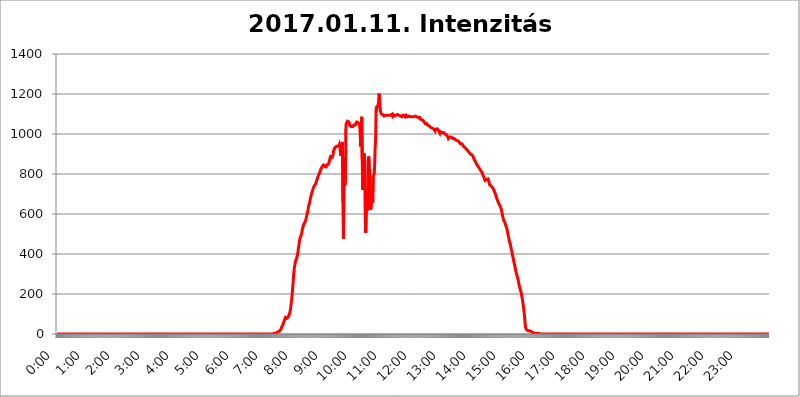
| Category | 2017.01.11. Intenzitás [W/m^2] |
|---|---|
| 0.0 | 0 |
| 0.0006944444444444445 | 0 |
| 0.001388888888888889 | 0 |
| 0.0020833333333333333 | 0 |
| 0.002777777777777778 | 0 |
| 0.003472222222222222 | 0 |
| 0.004166666666666667 | 0 |
| 0.004861111111111111 | 0 |
| 0.005555555555555556 | 0 |
| 0.0062499999999999995 | 0 |
| 0.006944444444444444 | 0 |
| 0.007638888888888889 | 0 |
| 0.008333333333333333 | 0 |
| 0.009027777777777779 | 0 |
| 0.009722222222222222 | 0 |
| 0.010416666666666666 | 0 |
| 0.011111111111111112 | 0 |
| 0.011805555555555555 | 0 |
| 0.012499999999999999 | 0 |
| 0.013194444444444444 | 0 |
| 0.013888888888888888 | 0 |
| 0.014583333333333332 | 0 |
| 0.015277777777777777 | 0 |
| 0.015972222222222224 | 0 |
| 0.016666666666666666 | 0 |
| 0.017361111111111112 | 0 |
| 0.018055555555555557 | 0 |
| 0.01875 | 0 |
| 0.019444444444444445 | 0 |
| 0.02013888888888889 | 0 |
| 0.020833333333333332 | 0 |
| 0.02152777777777778 | 0 |
| 0.022222222222222223 | 0 |
| 0.02291666666666667 | 0 |
| 0.02361111111111111 | 0 |
| 0.024305555555555556 | 0 |
| 0.024999999999999998 | 0 |
| 0.025694444444444447 | 0 |
| 0.02638888888888889 | 0 |
| 0.027083333333333334 | 0 |
| 0.027777777777777776 | 0 |
| 0.02847222222222222 | 0 |
| 0.029166666666666664 | 0 |
| 0.029861111111111113 | 0 |
| 0.030555555555555555 | 0 |
| 0.03125 | 0 |
| 0.03194444444444445 | 0 |
| 0.03263888888888889 | 0 |
| 0.03333333333333333 | 0 |
| 0.034027777777777775 | 0 |
| 0.034722222222222224 | 0 |
| 0.035416666666666666 | 0 |
| 0.036111111111111115 | 0 |
| 0.03680555555555556 | 0 |
| 0.0375 | 0 |
| 0.03819444444444444 | 0 |
| 0.03888888888888889 | 0 |
| 0.03958333333333333 | 0 |
| 0.04027777777777778 | 0 |
| 0.04097222222222222 | 0 |
| 0.041666666666666664 | 0 |
| 0.042361111111111106 | 0 |
| 0.04305555555555556 | 0 |
| 0.043750000000000004 | 0 |
| 0.044444444444444446 | 0 |
| 0.04513888888888889 | 0 |
| 0.04583333333333334 | 0 |
| 0.04652777777777778 | 0 |
| 0.04722222222222222 | 0 |
| 0.04791666666666666 | 0 |
| 0.04861111111111111 | 0 |
| 0.049305555555555554 | 0 |
| 0.049999999999999996 | 0 |
| 0.05069444444444445 | 0 |
| 0.051388888888888894 | 0 |
| 0.052083333333333336 | 0 |
| 0.05277777777777778 | 0 |
| 0.05347222222222222 | 0 |
| 0.05416666666666667 | 0 |
| 0.05486111111111111 | 0 |
| 0.05555555555555555 | 0 |
| 0.05625 | 0 |
| 0.05694444444444444 | 0 |
| 0.057638888888888885 | 0 |
| 0.05833333333333333 | 0 |
| 0.05902777777777778 | 0 |
| 0.059722222222222225 | 0 |
| 0.06041666666666667 | 0 |
| 0.061111111111111116 | 0 |
| 0.06180555555555556 | 0 |
| 0.0625 | 0 |
| 0.06319444444444444 | 0 |
| 0.06388888888888888 | 0 |
| 0.06458333333333334 | 0 |
| 0.06527777777777778 | 0 |
| 0.06597222222222222 | 0 |
| 0.06666666666666667 | 0 |
| 0.06736111111111111 | 0 |
| 0.06805555555555555 | 0 |
| 0.06874999999999999 | 0 |
| 0.06944444444444443 | 0 |
| 0.07013888888888889 | 0 |
| 0.07083333333333333 | 0 |
| 0.07152777777777779 | 0 |
| 0.07222222222222223 | 0 |
| 0.07291666666666667 | 0 |
| 0.07361111111111111 | 0 |
| 0.07430555555555556 | 0 |
| 0.075 | 0 |
| 0.07569444444444444 | 0 |
| 0.0763888888888889 | 0 |
| 0.07708333333333334 | 0 |
| 0.07777777777777778 | 0 |
| 0.07847222222222222 | 0 |
| 0.07916666666666666 | 0 |
| 0.0798611111111111 | 0 |
| 0.08055555555555556 | 0 |
| 0.08125 | 0 |
| 0.08194444444444444 | 0 |
| 0.08263888888888889 | 0 |
| 0.08333333333333333 | 0 |
| 0.08402777777777777 | 0 |
| 0.08472222222222221 | 0 |
| 0.08541666666666665 | 0 |
| 0.08611111111111112 | 0 |
| 0.08680555555555557 | 0 |
| 0.08750000000000001 | 0 |
| 0.08819444444444445 | 0 |
| 0.08888888888888889 | 0 |
| 0.08958333333333333 | 0 |
| 0.09027777777777778 | 0 |
| 0.09097222222222222 | 0 |
| 0.09166666666666667 | 0 |
| 0.09236111111111112 | 0 |
| 0.09305555555555556 | 0 |
| 0.09375 | 0 |
| 0.09444444444444444 | 0 |
| 0.09513888888888888 | 0 |
| 0.09583333333333333 | 0 |
| 0.09652777777777777 | 0 |
| 0.09722222222222222 | 0 |
| 0.09791666666666667 | 0 |
| 0.09861111111111111 | 0 |
| 0.09930555555555555 | 0 |
| 0.09999999999999999 | 0 |
| 0.10069444444444443 | 0 |
| 0.1013888888888889 | 0 |
| 0.10208333333333335 | 0 |
| 0.10277777777777779 | 0 |
| 0.10347222222222223 | 0 |
| 0.10416666666666667 | 0 |
| 0.10486111111111111 | 0 |
| 0.10555555555555556 | 0 |
| 0.10625 | 0 |
| 0.10694444444444444 | 0 |
| 0.1076388888888889 | 0 |
| 0.10833333333333334 | 0 |
| 0.10902777777777778 | 0 |
| 0.10972222222222222 | 0 |
| 0.1111111111111111 | 0 |
| 0.11180555555555556 | 0 |
| 0.11180555555555556 | 0 |
| 0.1125 | 0 |
| 0.11319444444444444 | 0 |
| 0.11388888888888889 | 0 |
| 0.11458333333333333 | 0 |
| 0.11527777777777777 | 0 |
| 0.11597222222222221 | 0 |
| 0.11666666666666665 | 0 |
| 0.1173611111111111 | 0 |
| 0.11805555555555557 | 0 |
| 0.11944444444444445 | 0 |
| 0.12013888888888889 | 0 |
| 0.12083333333333333 | 0 |
| 0.12152777777777778 | 0 |
| 0.12222222222222223 | 0 |
| 0.12291666666666667 | 0 |
| 0.12291666666666667 | 0 |
| 0.12361111111111112 | 0 |
| 0.12430555555555556 | 0 |
| 0.125 | 0 |
| 0.12569444444444444 | 0 |
| 0.12638888888888888 | 0 |
| 0.12708333333333333 | 0 |
| 0.16875 | 0 |
| 0.12847222222222224 | 0 |
| 0.12916666666666668 | 0 |
| 0.12986111111111112 | 0 |
| 0.13055555555555556 | 0 |
| 0.13125 | 0 |
| 0.13194444444444445 | 0 |
| 0.1326388888888889 | 0 |
| 0.13333333333333333 | 0 |
| 0.13402777777777777 | 0 |
| 0.13402777777777777 | 0 |
| 0.13472222222222222 | 0 |
| 0.13541666666666666 | 0 |
| 0.1361111111111111 | 0 |
| 0.13749999999999998 | 0 |
| 0.13819444444444443 | 0 |
| 0.1388888888888889 | 0 |
| 0.13958333333333334 | 0 |
| 0.14027777777777778 | 0 |
| 0.14097222222222222 | 0 |
| 0.14166666666666666 | 0 |
| 0.1423611111111111 | 0 |
| 0.14305555555555557 | 0 |
| 0.14375000000000002 | 0 |
| 0.14444444444444446 | 0 |
| 0.1451388888888889 | 0 |
| 0.1451388888888889 | 0 |
| 0.14652777777777778 | 0 |
| 0.14722222222222223 | 0 |
| 0.14791666666666667 | 0 |
| 0.1486111111111111 | 0 |
| 0.14930555555555555 | 0 |
| 0.15 | 0 |
| 0.15069444444444444 | 0 |
| 0.15138888888888888 | 0 |
| 0.15208333333333332 | 0 |
| 0.15277777777777776 | 0 |
| 0.15347222222222223 | 0 |
| 0.15416666666666667 | 0 |
| 0.15486111111111112 | 0 |
| 0.15555555555555556 | 0 |
| 0.15625 | 0 |
| 0.15694444444444444 | 0 |
| 0.15763888888888888 | 0 |
| 0.15833333333333333 | 0 |
| 0.15902777777777777 | 0 |
| 0.15972222222222224 | 0 |
| 0.16041666666666668 | 0 |
| 0.16111111111111112 | 0 |
| 0.16180555555555556 | 0 |
| 0.1625 | 0 |
| 0.16319444444444445 | 0 |
| 0.1638888888888889 | 0 |
| 0.16458333333333333 | 0 |
| 0.16527777777777777 | 0 |
| 0.16597222222222222 | 0 |
| 0.16666666666666666 | 0 |
| 0.1673611111111111 | 0 |
| 0.16805555555555554 | 0 |
| 0.16874999999999998 | 0 |
| 0.16944444444444443 | 0 |
| 0.17013888888888887 | 0 |
| 0.1708333333333333 | 0 |
| 0.17152777777777775 | 0 |
| 0.17222222222222225 | 0 |
| 0.1729166666666667 | 0 |
| 0.17361111111111113 | 0 |
| 0.17430555555555557 | 0 |
| 0.17500000000000002 | 0 |
| 0.17569444444444446 | 0 |
| 0.1763888888888889 | 0 |
| 0.17708333333333334 | 0 |
| 0.17777777777777778 | 0 |
| 0.17847222222222223 | 0 |
| 0.17916666666666667 | 0 |
| 0.1798611111111111 | 0 |
| 0.18055555555555555 | 0 |
| 0.18125 | 0 |
| 0.18194444444444444 | 0 |
| 0.1826388888888889 | 0 |
| 0.18333333333333335 | 0 |
| 0.1840277777777778 | 0 |
| 0.18472222222222223 | 0 |
| 0.18541666666666667 | 0 |
| 0.18611111111111112 | 0 |
| 0.18680555555555556 | 0 |
| 0.1875 | 0 |
| 0.18819444444444444 | 0 |
| 0.18888888888888888 | 0 |
| 0.18958333333333333 | 0 |
| 0.19027777777777777 | 0 |
| 0.1909722222222222 | 0 |
| 0.19166666666666665 | 0 |
| 0.19236111111111112 | 0 |
| 0.19305555555555554 | 0 |
| 0.19375 | 0 |
| 0.19444444444444445 | 0 |
| 0.1951388888888889 | 0 |
| 0.19583333333333333 | 0 |
| 0.19652777777777777 | 0 |
| 0.19722222222222222 | 0 |
| 0.19791666666666666 | 0 |
| 0.1986111111111111 | 0 |
| 0.19930555555555554 | 0 |
| 0.19999999999999998 | 0 |
| 0.20069444444444443 | 0 |
| 0.20138888888888887 | 0 |
| 0.2020833333333333 | 0 |
| 0.2027777777777778 | 0 |
| 0.2034722222222222 | 0 |
| 0.2041666666666667 | 0 |
| 0.20486111111111113 | 0 |
| 0.20555555555555557 | 0 |
| 0.20625000000000002 | 0 |
| 0.20694444444444446 | 0 |
| 0.2076388888888889 | 0 |
| 0.20833333333333334 | 0 |
| 0.20902777777777778 | 0 |
| 0.20972222222222223 | 0 |
| 0.21041666666666667 | 0 |
| 0.2111111111111111 | 0 |
| 0.21180555555555555 | 0 |
| 0.2125 | 0 |
| 0.21319444444444444 | 0 |
| 0.2138888888888889 | 0 |
| 0.21458333333333335 | 0 |
| 0.2152777777777778 | 0 |
| 0.21597222222222223 | 0 |
| 0.21666666666666667 | 0 |
| 0.21736111111111112 | 0 |
| 0.21805555555555556 | 0 |
| 0.21875 | 0 |
| 0.21944444444444444 | 0 |
| 0.22013888888888888 | 0 |
| 0.22083333333333333 | 0 |
| 0.22152777777777777 | 0 |
| 0.2222222222222222 | 0 |
| 0.22291666666666665 | 0 |
| 0.2236111111111111 | 0 |
| 0.22430555555555556 | 0 |
| 0.225 | 0 |
| 0.22569444444444445 | 0 |
| 0.2263888888888889 | 0 |
| 0.22708333333333333 | 0 |
| 0.22777777777777777 | 0 |
| 0.22847222222222222 | 0 |
| 0.22916666666666666 | 0 |
| 0.2298611111111111 | 0 |
| 0.23055555555555554 | 0 |
| 0.23124999999999998 | 0 |
| 0.23194444444444443 | 0 |
| 0.23263888888888887 | 0 |
| 0.2333333333333333 | 0 |
| 0.2340277777777778 | 0 |
| 0.2347222222222222 | 0 |
| 0.2354166666666667 | 0 |
| 0.23611111111111113 | 0 |
| 0.23680555555555557 | 0 |
| 0.23750000000000002 | 0 |
| 0.23819444444444446 | 0 |
| 0.2388888888888889 | 0 |
| 0.23958333333333334 | 0 |
| 0.24027777777777778 | 0 |
| 0.24097222222222223 | 0 |
| 0.24166666666666667 | 0 |
| 0.2423611111111111 | 0 |
| 0.24305555555555555 | 0 |
| 0.24375 | 0 |
| 0.24444444444444446 | 0 |
| 0.24513888888888888 | 0 |
| 0.24583333333333335 | 0 |
| 0.2465277777777778 | 0 |
| 0.24722222222222223 | 0 |
| 0.24791666666666667 | 0 |
| 0.24861111111111112 | 0 |
| 0.24930555555555556 | 0 |
| 0.25 | 0 |
| 0.25069444444444444 | 0 |
| 0.2513888888888889 | 0 |
| 0.2520833333333333 | 0 |
| 0.25277777777777777 | 0 |
| 0.2534722222222222 | 0 |
| 0.25416666666666665 | 0 |
| 0.2548611111111111 | 0 |
| 0.2555555555555556 | 0 |
| 0.25625000000000003 | 0 |
| 0.2569444444444445 | 0 |
| 0.2576388888888889 | 0 |
| 0.25833333333333336 | 0 |
| 0.2590277777777778 | 0 |
| 0.25972222222222224 | 0 |
| 0.2604166666666667 | 0 |
| 0.2611111111111111 | 0 |
| 0.26180555555555557 | 0 |
| 0.2625 | 0 |
| 0.26319444444444445 | 0 |
| 0.2638888888888889 | 0 |
| 0.26458333333333334 | 0 |
| 0.2652777777777778 | 0 |
| 0.2659722222222222 | 0 |
| 0.26666666666666666 | 0 |
| 0.2673611111111111 | 0 |
| 0.26805555555555555 | 0 |
| 0.26875 | 0 |
| 0.26944444444444443 | 0 |
| 0.2701388888888889 | 0 |
| 0.2708333333333333 | 0 |
| 0.27152777777777776 | 0 |
| 0.2722222222222222 | 0 |
| 0.27291666666666664 | 0 |
| 0.2736111111111111 | 0 |
| 0.2743055555555555 | 0 |
| 0.27499999999999997 | 0 |
| 0.27569444444444446 | 0 |
| 0.27638888888888885 | 0 |
| 0.27708333333333335 | 0 |
| 0.2777777777777778 | 0 |
| 0.27847222222222223 | 0 |
| 0.2791666666666667 | 0 |
| 0.2798611111111111 | 0 |
| 0.28055555555555556 | 0 |
| 0.28125 | 0 |
| 0.28194444444444444 | 0 |
| 0.2826388888888889 | 0 |
| 0.2833333333333333 | 0 |
| 0.28402777777777777 | 0 |
| 0.2847222222222222 | 0 |
| 0.28541666666666665 | 0 |
| 0.28611111111111115 | 0 |
| 0.28680555555555554 | 0 |
| 0.28750000000000003 | 0 |
| 0.2881944444444445 | 0 |
| 0.2888888888888889 | 0 |
| 0.28958333333333336 | 0 |
| 0.2902777777777778 | 0 |
| 0.29097222222222224 | 0 |
| 0.2916666666666667 | 0 |
| 0.2923611111111111 | 0 |
| 0.29305555555555557 | 0 |
| 0.29375 | 0 |
| 0.29444444444444445 | 0 |
| 0.2951388888888889 | 0 |
| 0.29583333333333334 | 0 |
| 0.2965277777777778 | 0 |
| 0.2972222222222222 | 0 |
| 0.29791666666666666 | 0 |
| 0.2986111111111111 | 0 |
| 0.29930555555555555 | 0 |
| 0.3 | 0 |
| 0.30069444444444443 | 0 |
| 0.3013888888888889 | 0 |
| 0.3020833333333333 | 0 |
| 0.30277777777777776 | 3.525 |
| 0.3034722222222222 | 3.525 |
| 0.30416666666666664 | 3.525 |
| 0.3048611111111111 | 3.525 |
| 0.3055555555555555 | 3.525 |
| 0.30624999999999997 | 3.525 |
| 0.3069444444444444 | 3.525 |
| 0.3076388888888889 | 7.887 |
| 0.30833333333333335 | 7.887 |
| 0.3090277777777778 | 7.887 |
| 0.30972222222222223 | 12.257 |
| 0.3104166666666667 | 12.257 |
| 0.3111111111111111 | 12.257 |
| 0.31180555555555556 | 12.257 |
| 0.3125 | 16.636 |
| 0.31319444444444444 | 21.024 |
| 0.3138888888888889 | 25.419 |
| 0.3145833333333333 | 29.823 |
| 0.31527777777777777 | 38.653 |
| 0.3159722222222222 | 43.079 |
| 0.31666666666666665 | 47.511 |
| 0.31736111111111115 | 56.398 |
| 0.31805555555555554 | 60.85 |
| 0.31875000000000003 | 69.775 |
| 0.3194444444444445 | 74.246 |
| 0.3201388888888889 | 83.205 |
| 0.32083333333333336 | 83.205 |
| 0.3215277777777778 | 83.205 |
| 0.32222222222222224 | 78.722 |
| 0.3229166666666667 | 83.205 |
| 0.3236111111111111 | 83.205 |
| 0.32430555555555557 | 87.692 |
| 0.325 | 92.184 |
| 0.32569444444444445 | 101.184 |
| 0.3263888888888889 | 110.201 |
| 0.32708333333333334 | 123.758 |
| 0.3277777777777778 | 141.884 |
| 0.3284722222222222 | 164.605 |
| 0.32916666666666666 | 182.82 |
| 0.3298611111111111 | 214.746 |
| 0.33055555555555555 | 246.689 |
| 0.33125 | 283.156 |
| 0.33194444444444443 | 310.44 |
| 0.3326388888888889 | 333.113 |
| 0.3333333333333333 | 346.682 |
| 0.3340277777777778 | 360.221 |
| 0.3347222222222222 | 369.23 |
| 0.3354166666666667 | 373.729 |
| 0.3361111111111111 | 382.715 |
| 0.3368055555555556 | 387.202 |
| 0.33749999999999997 | 405.108 |
| 0.33819444444444446 | 427.39 |
| 0.33888888888888885 | 440.702 |
| 0.33958333333333335 | 462.786 |
| 0.34027777777777773 | 475.972 |
| 0.34097222222222223 | 480.356 |
| 0.3416666666666666 | 489.108 |
| 0.3423611111111111 | 497.836 |
| 0.3430555555555555 | 506.542 |
| 0.34375 | 523.88 |
| 0.3444444444444445 | 532.513 |
| 0.3451388888888889 | 541.121 |
| 0.3458333333333334 | 549.704 |
| 0.34652777777777777 | 545.416 |
| 0.34722222222222227 | 549.704 |
| 0.34791666666666665 | 562.53 |
| 0.34861111111111115 | 571.049 |
| 0.34930555555555554 | 583.779 |
| 0.35000000000000003 | 592.233 |
| 0.3506944444444444 | 604.864 |
| 0.3513888888888889 | 613.252 |
| 0.3520833333333333 | 629.948 |
| 0.3527777777777778 | 642.4 |
| 0.3534722222222222 | 650.667 |
| 0.3541666666666667 | 658.909 |
| 0.3548611111111111 | 675.311 |
| 0.35555555555555557 | 683.473 |
| 0.35625 | 695.666 |
| 0.35694444444444445 | 703.762 |
| 0.3576388888888889 | 711.832 |
| 0.35833333333333334 | 719.877 |
| 0.3590277777777778 | 727.896 |
| 0.3597222222222222 | 735.89 |
| 0.36041666666666666 | 739.877 |
| 0.3611111111111111 | 743.859 |
| 0.36180555555555555 | 747.834 |
| 0.3625 | 751.803 |
| 0.36319444444444443 | 759.723 |
| 0.3638888888888889 | 767.62 |
| 0.3645833333333333 | 775.492 |
| 0.3652777777777778 | 783.342 |
| 0.3659722222222222 | 787.258 |
| 0.3666666666666667 | 795.074 |
| 0.3673611111111111 | 798.974 |
| 0.3680555555555556 | 806.757 |
| 0.36874999999999997 | 810.641 |
| 0.36944444444444446 | 822.26 |
| 0.37013888888888885 | 822.26 |
| 0.37083333333333335 | 829.981 |
| 0.37152777777777773 | 837.682 |
| 0.37222222222222223 | 837.682 |
| 0.3729166666666666 | 841.526 |
| 0.3736111111111111 | 845.365 |
| 0.3743055555555555 | 849.199 |
| 0.375 | 841.526 |
| 0.3756944444444445 | 841.526 |
| 0.3763888888888889 | 829.981 |
| 0.3770833333333334 | 837.682 |
| 0.37777777777777777 | 841.526 |
| 0.37847222222222227 | 845.365 |
| 0.37916666666666665 | 845.365 |
| 0.37986111111111115 | 845.365 |
| 0.38055555555555554 | 849.199 |
| 0.38125000000000003 | 860.676 |
| 0.3819444444444444 | 868.305 |
| 0.3826388888888889 | 879.719 |
| 0.3833333333333333 | 887.309 |
| 0.3840277777777778 | 883.516 |
| 0.3847222222222222 | 883.516 |
| 0.3854166666666667 | 883.516 |
| 0.3861111111111111 | 887.309 |
| 0.38680555555555557 | 894.885 |
| 0.3875 | 913.766 |
| 0.38819444444444445 | 921.298 |
| 0.3888888888888889 | 928.819 |
| 0.38958333333333334 | 925.06 |
| 0.3902777777777778 | 932.576 |
| 0.3909722222222222 | 936.33 |
| 0.39166666666666666 | 936.33 |
| 0.3923611111111111 | 932.576 |
| 0.39305555555555555 | 940.082 |
| 0.39375 | 940.082 |
| 0.39444444444444443 | 940.082 |
| 0.3951388888888889 | 940.082 |
| 0.3958333333333333 | 947.58 |
| 0.3965277777777778 | 936.33 |
| 0.3972222222222222 | 902.447 |
| 0.3979166666666667 | 891.099 |
| 0.3986111111111111 | 887.309 |
| 0.3993055555555556 | 940.082 |
| 0.39999999999999997 | 958.814 |
| 0.40069444444444446 | 658.909 |
| 0.40138888888888885 | 475.972 |
| 0.40208333333333335 | 771.559 |
| 0.40277777777777773 | 751.803 |
| 0.40347222222222223 | 743.859 |
| 0.4041666666666666 | 767.62 |
| 0.4048611111111111 | 1044.762 |
| 0.4055555555555555 | 1052.255 |
| 0.40625 | 1052.255 |
| 0.4069444444444445 | 1063.51 |
| 0.4076388888888889 | 1067.267 |
| 0.4083333333333334 | 1063.51 |
| 0.40902777777777777 | 1059.756 |
| 0.40972222222222227 | 1052.255 |
| 0.41041666666666665 | 1041.019 |
| 0.41111111111111115 | 1041.019 |
| 0.41180555555555554 | 1041.019 |
| 0.41250000000000003 | 1037.277 |
| 0.4131944444444444 | 1037.277 |
| 0.4138888888888889 | 1037.277 |
| 0.4145833333333333 | 1037.277 |
| 0.4152777777777778 | 1037.277 |
| 0.4159722222222222 | 1044.762 |
| 0.4166666666666667 | 1048.508 |
| 0.4173611111111111 | 1044.762 |
| 0.41805555555555557 | 1044.762 |
| 0.41875 | 1052.255 |
| 0.41944444444444445 | 1056.004 |
| 0.4201388888888889 | 1059.756 |
| 0.42083333333333334 | 1059.756 |
| 0.4215277777777778 | 1063.51 |
| 0.4222222222222222 | 1056.004 |
| 0.42291666666666666 | 1052.255 |
| 0.4236111111111111 | 1052.255 |
| 0.42430555555555555 | 1041.019 |
| 0.425 | 992.448 |
| 0.42569444444444443 | 936.33 |
| 0.4263888888888889 | 984.98 |
| 0.4270833333333333 | 1086.097 |
| 0.4277777777777778 | 872.114 |
| 0.4284722222222222 | 719.877 |
| 0.4291666666666667 | 822.26 |
| 0.4298611111111111 | 833.834 |
| 0.4305555555555556 | 902.447 |
| 0.43124999999999997 | 860.676 |
| 0.43194444444444446 | 583.779 |
| 0.43263888888888885 | 506.542 |
| 0.43333333333333335 | 617.436 |
| 0.43402777777777773 | 719.877 |
| 0.43472222222222223 | 617.436 |
| 0.4354166666666666 | 715.858 |
| 0.4361111111111111 | 849.199 |
| 0.4368055555555555 | 887.309 |
| 0.4375 | 841.526 |
| 0.4381944444444445 | 802.868 |
| 0.4388888888888889 | 667.123 |
| 0.4395833333333334 | 621.613 |
| 0.44027777777777777 | 621.613 |
| 0.44097222222222227 | 675.311 |
| 0.44166666666666665 | 675.311 |
| 0.44236111111111115 | 654.791 |
| 0.44305555555555554 | 787.258 |
| 0.44375000000000003 | 783.342 |
| 0.4444444444444444 | 798.974 |
| 0.4451388888888889 | 837.682 |
| 0.4458333333333333 | 928.819 |
| 0.4465277777777778 | 970.034 |
| 0.4472222222222222 | 1124.056 |
| 0.4479166666666667 | 1139.384 |
| 0.4486111111111111 | 1131.708 |
| 0.44930555555555557 | 1127.879 |
| 0.45 | 1135.543 |
| 0.45069444444444445 | 1154.814 |
| 0.4513888888888889 | 1201.843 |
| 0.45208333333333334 | 1182.099 |
| 0.4527777777777778 | 1131.708 |
| 0.4534722222222222 | 1112.618 |
| 0.45416666666666666 | 1101.226 |
| 0.4548611111111111 | 1097.437 |
| 0.45555555555555555 | 1097.437 |
| 0.45625 | 1097.437 |
| 0.45694444444444443 | 1093.653 |
| 0.4576388888888889 | 1093.653 |
| 0.4583333333333333 | 1089.873 |
| 0.4590277777777778 | 1093.653 |
| 0.4597222222222222 | 1093.653 |
| 0.4604166666666667 | 1093.653 |
| 0.4611111111111111 | 1093.653 |
| 0.4618055555555556 | 1093.653 |
| 0.46249999999999997 | 1093.653 |
| 0.46319444444444446 | 1093.653 |
| 0.46388888888888885 | 1097.437 |
| 0.46458333333333335 | 1093.653 |
| 0.46527777777777773 | 1093.653 |
| 0.46597222222222223 | 1097.437 |
| 0.4666666666666666 | 1093.653 |
| 0.4673611111111111 | 1093.653 |
| 0.4680555555555555 | 1093.653 |
| 0.46875 | 1097.437 |
| 0.4694444444444445 | 1093.653 |
| 0.4701388888888889 | 1089.873 |
| 0.4708333333333334 | 1097.437 |
| 0.47152777777777777 | 1093.653 |
| 0.47222222222222227 | 1093.653 |
| 0.47291666666666665 | 1089.873 |
| 0.47361111111111115 | 1089.873 |
| 0.47430555555555554 | 1093.653 |
| 0.47500000000000003 | 1093.653 |
| 0.4756944444444444 | 1093.653 |
| 0.4763888888888889 | 1093.653 |
| 0.4770833333333333 | 1097.437 |
| 0.4777777777777778 | 1097.437 |
| 0.4784722222222222 | 1097.437 |
| 0.4791666666666667 | 1093.653 |
| 0.4798611111111111 | 1089.873 |
| 0.48055555555555557 | 1089.873 |
| 0.48125 | 1089.873 |
| 0.48194444444444445 | 1089.873 |
| 0.4826388888888889 | 1089.873 |
| 0.48333333333333334 | 1086.097 |
| 0.4840277777777778 | 1089.873 |
| 0.4847222222222222 | 1093.653 |
| 0.48541666666666666 | 1089.873 |
| 0.4861111111111111 | 1089.873 |
| 0.48680555555555555 | 1093.653 |
| 0.4875 | 1089.873 |
| 0.48819444444444443 | 1086.097 |
| 0.4888888888888889 | 1086.097 |
| 0.4895833333333333 | 1093.653 |
| 0.4902777777777778 | 1089.873 |
| 0.4909722222222222 | 1089.873 |
| 0.4916666666666667 | 1086.097 |
| 0.4923611111111111 | 1086.097 |
| 0.4930555555555556 | 1086.097 |
| 0.49374999999999997 | 1089.873 |
| 0.49444444444444446 | 1089.873 |
| 0.49513888888888885 | 1086.097 |
| 0.49583333333333335 | 1086.097 |
| 0.49652777777777773 | 1086.097 |
| 0.49722222222222223 | 1086.097 |
| 0.4979166666666666 | 1086.097 |
| 0.4986111111111111 | 1082.324 |
| 0.4993055555555555 | 1086.097 |
| 0.5 | 1086.097 |
| 0.5006944444444444 | 1086.097 |
| 0.5013888888888889 | 1086.097 |
| 0.5020833333333333 | 1089.873 |
| 0.5027777777777778 | 1089.873 |
| 0.5034722222222222 | 1086.097 |
| 0.5041666666666667 | 1086.097 |
| 0.5048611111111111 | 1082.324 |
| 0.5055555555555555 | 1082.324 |
| 0.50625 | 1082.324 |
| 0.5069444444444444 | 1082.324 |
| 0.5076388888888889 | 1082.324 |
| 0.5083333333333333 | 1082.324 |
| 0.5090277777777777 | 1074.789 |
| 0.5097222222222222 | 1071.027 |
| 0.5104166666666666 | 1071.027 |
| 0.5111111111111112 | 1071.027 |
| 0.5118055555555555 | 1071.027 |
| 0.5125000000000001 | 1067.267 |
| 0.5131944444444444 | 1067.267 |
| 0.513888888888889 | 1063.51 |
| 0.5145833333333333 | 1059.756 |
| 0.5152777777777778 | 1059.756 |
| 0.5159722222222222 | 1052.255 |
| 0.5166666666666667 | 1048.508 |
| 0.517361111111111 | 1048.508 |
| 0.5180555555555556 | 1052.255 |
| 0.5187499999999999 | 1048.508 |
| 0.5194444444444445 | 1044.762 |
| 0.5201388888888888 | 1044.762 |
| 0.5208333333333334 | 1044.762 |
| 0.5215277777777778 | 1041.019 |
| 0.5222222222222223 | 1037.277 |
| 0.5229166666666667 | 1037.277 |
| 0.5236111111111111 | 1033.537 |
| 0.5243055555555556 | 1033.537 |
| 0.525 | 1029.798 |
| 0.5256944444444445 | 1029.798 |
| 0.5263888888888889 | 1033.537 |
| 0.5270833333333333 | 1029.798 |
| 0.5277777777777778 | 1026.06 |
| 0.5284722222222222 | 1022.323 |
| 0.5291666666666667 | 1029.798 |
| 0.5298611111111111 | 1014.852 |
| 0.5305555555555556 | 1022.323 |
| 0.53125 | 1018.587 |
| 0.5319444444444444 | 1022.323 |
| 0.5326388888888889 | 1026.06 |
| 0.5333333333333333 | 1026.06 |
| 0.5340277777777778 | 1022.323 |
| 0.5347222222222222 | 1018.587 |
| 0.5354166666666667 | 1018.587 |
| 0.5361111111111111 | 1014.852 |
| 0.5368055555555555 | 1003.65 |
| 0.5375 | 1011.118 |
| 0.5381944444444444 | 1007.383 |
| 0.5388888888888889 | 1011.118 |
| 0.5395833333333333 | 1007.383 |
| 0.5402777777777777 | 1007.383 |
| 0.5409722222222222 | 1007.383 |
| 0.5416666666666666 | 1007.383 |
| 0.5423611111111112 | 1007.383 |
| 0.5430555555555555 | 1003.65 |
| 0.5437500000000001 | 999.916 |
| 0.5444444444444444 | 999.916 |
| 0.545138888888889 | 1003.65 |
| 0.5458333333333333 | 996.182 |
| 0.5465277777777778 | 992.448 |
| 0.5472222222222222 | 992.448 |
| 0.5479166666666667 | 984.98 |
| 0.548611111111111 | 977.508 |
| 0.5493055555555556 | 977.508 |
| 0.5499999999999999 | 977.508 |
| 0.5506944444444445 | 984.98 |
| 0.5513888888888888 | 981.244 |
| 0.5520833333333334 | 984.98 |
| 0.5527777777777778 | 984.98 |
| 0.5534722222222223 | 981.244 |
| 0.5541666666666667 | 981.244 |
| 0.5548611111111111 | 977.508 |
| 0.5555555555555556 | 977.508 |
| 0.55625 | 977.508 |
| 0.5569444444444445 | 977.508 |
| 0.5576388888888889 | 977.508 |
| 0.5583333333333333 | 973.772 |
| 0.5590277777777778 | 970.034 |
| 0.5597222222222222 | 966.295 |
| 0.5604166666666667 | 966.295 |
| 0.5611111111111111 | 966.295 |
| 0.5618055555555556 | 962.555 |
| 0.5625 | 962.555 |
| 0.5631944444444444 | 962.555 |
| 0.5638888888888889 | 958.814 |
| 0.5645833333333333 | 958.814 |
| 0.5652777777777778 | 951.327 |
| 0.5659722222222222 | 947.58 |
| 0.5666666666666667 | 951.327 |
| 0.5673611111111111 | 951.327 |
| 0.5680555555555555 | 951.327 |
| 0.56875 | 947.58 |
| 0.5694444444444444 | 940.082 |
| 0.5701388888888889 | 940.082 |
| 0.5708333333333333 | 936.33 |
| 0.5715277777777777 | 932.576 |
| 0.5722222222222222 | 932.576 |
| 0.5729166666666666 | 932.576 |
| 0.5736111111111112 | 925.06 |
| 0.5743055555555555 | 925.06 |
| 0.5750000000000001 | 921.298 |
| 0.5756944444444444 | 917.534 |
| 0.576388888888889 | 913.766 |
| 0.5770833333333333 | 913.766 |
| 0.5777777777777778 | 906.223 |
| 0.5784722222222222 | 902.447 |
| 0.5791666666666667 | 902.447 |
| 0.579861111111111 | 898.668 |
| 0.5805555555555556 | 898.668 |
| 0.5812499999999999 | 894.885 |
| 0.5819444444444445 | 894.885 |
| 0.5826388888888888 | 891.099 |
| 0.5833333333333334 | 887.309 |
| 0.5840277777777778 | 879.719 |
| 0.5847222222222223 | 872.114 |
| 0.5854166666666667 | 868.305 |
| 0.5861111111111111 | 868.305 |
| 0.5868055555555556 | 860.676 |
| 0.5875 | 853.029 |
| 0.5881944444444445 | 849.199 |
| 0.5888888888888889 | 845.365 |
| 0.5895833333333333 | 845.365 |
| 0.5902777777777778 | 837.682 |
| 0.5909722222222222 | 833.834 |
| 0.5916666666666667 | 829.981 |
| 0.5923611111111111 | 826.123 |
| 0.5930555555555556 | 822.26 |
| 0.59375 | 822.26 |
| 0.5944444444444444 | 818.392 |
| 0.5951388888888889 | 810.641 |
| 0.5958333333333333 | 806.757 |
| 0.5965277777777778 | 802.868 |
| 0.5972222222222222 | 791.169 |
| 0.5979166666666667 | 787.258 |
| 0.5986111111111111 | 783.342 |
| 0.5993055555555555 | 775.492 |
| 0.6 | 767.62 |
| 0.6006944444444444 | 763.674 |
| 0.6013888888888889 | 767.62 |
| 0.6020833333333333 | 771.559 |
| 0.6027777777777777 | 775.492 |
| 0.6034722222222222 | 771.559 |
| 0.6041666666666666 | 775.492 |
| 0.6048611111111112 | 767.62 |
| 0.6055555555555555 | 759.723 |
| 0.6062500000000001 | 747.834 |
| 0.6069444444444444 | 747.834 |
| 0.607638888888889 | 747.834 |
| 0.6083333333333333 | 739.877 |
| 0.6090277777777778 | 735.89 |
| 0.6097222222222222 | 739.877 |
| 0.6104166666666667 | 731.896 |
| 0.611111111111111 | 727.896 |
| 0.6118055555555556 | 723.889 |
| 0.6124999999999999 | 719.877 |
| 0.6131944444444445 | 711.832 |
| 0.6138888888888888 | 707.8 |
| 0.6145833333333334 | 699.717 |
| 0.6152777777777778 | 691.608 |
| 0.6159722222222223 | 683.473 |
| 0.6166666666666667 | 675.311 |
| 0.6173611111111111 | 671.22 |
| 0.6180555555555556 | 663.019 |
| 0.61875 | 658.909 |
| 0.6194444444444445 | 650.667 |
| 0.6201388888888889 | 646.537 |
| 0.6208333333333333 | 642.4 |
| 0.6215277777777778 | 638.256 |
| 0.6222222222222222 | 629.948 |
| 0.6229166666666667 | 621.613 |
| 0.6236111111111111 | 609.062 |
| 0.6243055555555556 | 596.45 |
| 0.625 | 583.779 |
| 0.6256944444444444 | 575.299 |
| 0.6263888888888889 | 566.793 |
| 0.6270833333333333 | 562.53 |
| 0.6277777777777778 | 558.261 |
| 0.6284722222222222 | 549.704 |
| 0.6291666666666667 | 541.121 |
| 0.6298611111111111 | 536.82 |
| 0.6305555555555555 | 528.2 |
| 0.63125 | 515.223 |
| 0.6319444444444444 | 502.192 |
| 0.6326388888888889 | 489.108 |
| 0.6333333333333333 | 480.356 |
| 0.6340277777777777 | 462.786 |
| 0.6347222222222222 | 458.38 |
| 0.6354166666666666 | 449.551 |
| 0.6361111111111112 | 436.27 |
| 0.6368055555555555 | 422.943 |
| 0.6375000000000001 | 414.035 |
| 0.6381944444444444 | 400.638 |
| 0.638888888888889 | 387.202 |
| 0.6395833333333333 | 378.224 |
| 0.6402777777777778 | 364.728 |
| 0.6409722222222222 | 351.198 |
| 0.6416666666666667 | 342.162 |
| 0.642361111111111 | 328.584 |
| 0.6430555555555556 | 314.98 |
| 0.6437499999999999 | 305.898 |
| 0.6444444444444445 | 301.354 |
| 0.6451388888888888 | 287.709 |
| 0.6458333333333334 | 278.603 |
| 0.6465277777777778 | 269.49 |
| 0.6472222222222223 | 255.813 |
| 0.6479166666666667 | 242.127 |
| 0.6486111111111111 | 233 |
| 0.6493055555555556 | 223.873 |
| 0.65 | 214.746 |
| 0.6506944444444445 | 205.62 |
| 0.6513888888888889 | 191.937 |
| 0.6520833333333333 | 178.264 |
| 0.6527777777777778 | 164.605 |
| 0.6534722222222222 | 146.423 |
| 0.6541666666666667 | 128.284 |
| 0.6548611111111111 | 105.69 |
| 0.6555555555555556 | 78.722 |
| 0.65625 | 51.951 |
| 0.6569444444444444 | 29.823 |
| 0.6576388888888889 | 25.419 |
| 0.6583333333333333 | 21.024 |
| 0.6590277777777778 | 21.024 |
| 0.6597222222222222 | 21.024 |
| 0.6604166666666667 | 16.636 |
| 0.6611111111111111 | 16.636 |
| 0.6618055555555555 | 16.636 |
| 0.6625 | 16.636 |
| 0.6631944444444444 | 12.257 |
| 0.6638888888888889 | 12.257 |
| 0.6645833333333333 | 12.257 |
| 0.6652777777777777 | 7.887 |
| 0.6659722222222222 | 7.887 |
| 0.6666666666666666 | 7.887 |
| 0.6673611111111111 | 7.887 |
| 0.6680555555555556 | 7.887 |
| 0.6687500000000001 | 3.525 |
| 0.6694444444444444 | 3.525 |
| 0.6701388888888888 | 3.525 |
| 0.6708333333333334 | 3.525 |
| 0.6715277777777778 | 3.525 |
| 0.6722222222222222 | 3.525 |
| 0.6729166666666666 | 3.525 |
| 0.6736111111111112 | 3.525 |
| 0.6743055555555556 | 3.525 |
| 0.6749999999999999 | 3.525 |
| 0.6756944444444444 | 0 |
| 0.6763888888888889 | 0 |
| 0.6770833333333334 | 0 |
| 0.6777777777777777 | 0 |
| 0.6784722222222223 | 0 |
| 0.6791666666666667 | 0 |
| 0.6798611111111111 | 0 |
| 0.6805555555555555 | 0 |
| 0.68125 | 0 |
| 0.6819444444444445 | 0 |
| 0.6826388888888889 | 0 |
| 0.6833333333333332 | 0 |
| 0.6840277777777778 | 0 |
| 0.6847222222222222 | 0 |
| 0.6854166666666667 | 0 |
| 0.686111111111111 | 0 |
| 0.6868055555555556 | 0 |
| 0.6875 | 0 |
| 0.6881944444444444 | 0 |
| 0.688888888888889 | 0 |
| 0.6895833333333333 | 0 |
| 0.6902777777777778 | 0 |
| 0.6909722222222222 | 0 |
| 0.6916666666666668 | 0 |
| 0.6923611111111111 | 0 |
| 0.6930555555555555 | 0 |
| 0.69375 | 0 |
| 0.6944444444444445 | 0 |
| 0.6951388888888889 | 0 |
| 0.6958333333333333 | 0 |
| 0.6965277777777777 | 0 |
| 0.6972222222222223 | 0 |
| 0.6979166666666666 | 0 |
| 0.6986111111111111 | 0 |
| 0.6993055555555556 | 0 |
| 0.7000000000000001 | 0 |
| 0.7006944444444444 | 0 |
| 0.7013888888888888 | 0 |
| 0.7020833333333334 | 0 |
| 0.7027777777777778 | 0 |
| 0.7034722222222222 | 0 |
| 0.7041666666666666 | 0 |
| 0.7048611111111112 | 0 |
| 0.7055555555555556 | 0 |
| 0.7062499999999999 | 0 |
| 0.7069444444444444 | 0 |
| 0.7076388888888889 | 0 |
| 0.7083333333333334 | 0 |
| 0.7090277777777777 | 0 |
| 0.7097222222222223 | 0 |
| 0.7104166666666667 | 0 |
| 0.7111111111111111 | 0 |
| 0.7118055555555555 | 0 |
| 0.7125 | 0 |
| 0.7131944444444445 | 0 |
| 0.7138888888888889 | 0 |
| 0.7145833333333332 | 0 |
| 0.7152777777777778 | 0 |
| 0.7159722222222222 | 0 |
| 0.7166666666666667 | 0 |
| 0.717361111111111 | 0 |
| 0.7180555555555556 | 0 |
| 0.71875 | 0 |
| 0.7194444444444444 | 0 |
| 0.720138888888889 | 0 |
| 0.7208333333333333 | 0 |
| 0.7215277777777778 | 0 |
| 0.7222222222222222 | 0 |
| 0.7229166666666668 | 0 |
| 0.7236111111111111 | 0 |
| 0.7243055555555555 | 0 |
| 0.725 | 0 |
| 0.7256944444444445 | 0 |
| 0.7263888888888889 | 0 |
| 0.7270833333333333 | 0 |
| 0.7277777777777777 | 0 |
| 0.7284722222222223 | 0 |
| 0.7291666666666666 | 0 |
| 0.7298611111111111 | 0 |
| 0.7305555555555556 | 0 |
| 0.7312500000000001 | 0 |
| 0.7319444444444444 | 0 |
| 0.7326388888888888 | 0 |
| 0.7333333333333334 | 0 |
| 0.7340277777777778 | 0 |
| 0.7347222222222222 | 0 |
| 0.7354166666666666 | 0 |
| 0.7361111111111112 | 0 |
| 0.7368055555555556 | 0 |
| 0.7374999999999999 | 0 |
| 0.7381944444444444 | 0 |
| 0.7388888888888889 | 0 |
| 0.7395833333333334 | 0 |
| 0.7402777777777777 | 0 |
| 0.7409722222222223 | 0 |
| 0.7416666666666667 | 0 |
| 0.7423611111111111 | 0 |
| 0.7430555555555555 | 0 |
| 0.74375 | 0 |
| 0.7444444444444445 | 0 |
| 0.7451388888888889 | 0 |
| 0.7458333333333332 | 0 |
| 0.7465277777777778 | 0 |
| 0.7472222222222222 | 0 |
| 0.7479166666666667 | 0 |
| 0.748611111111111 | 0 |
| 0.7493055555555556 | 0 |
| 0.75 | 0 |
| 0.7506944444444444 | 0 |
| 0.751388888888889 | 0 |
| 0.7520833333333333 | 0 |
| 0.7527777777777778 | 0 |
| 0.7534722222222222 | 0 |
| 0.7541666666666668 | 0 |
| 0.7548611111111111 | 0 |
| 0.7555555555555555 | 0 |
| 0.75625 | 0 |
| 0.7569444444444445 | 0 |
| 0.7576388888888889 | 0 |
| 0.7583333333333333 | 0 |
| 0.7590277777777777 | 0 |
| 0.7597222222222223 | 0 |
| 0.7604166666666666 | 0 |
| 0.7611111111111111 | 0 |
| 0.7618055555555556 | 0 |
| 0.7625000000000001 | 0 |
| 0.7631944444444444 | 0 |
| 0.7638888888888888 | 0 |
| 0.7645833333333334 | 0 |
| 0.7652777777777778 | 0 |
| 0.7659722222222222 | 0 |
| 0.7666666666666666 | 0 |
| 0.7673611111111112 | 0 |
| 0.7680555555555556 | 0 |
| 0.7687499999999999 | 0 |
| 0.7694444444444444 | 0 |
| 0.7701388888888889 | 0 |
| 0.7708333333333334 | 0 |
| 0.7715277777777777 | 0 |
| 0.7722222222222223 | 0 |
| 0.7729166666666667 | 0 |
| 0.7736111111111111 | 0 |
| 0.7743055555555555 | 0 |
| 0.775 | 0 |
| 0.7756944444444445 | 0 |
| 0.7763888888888889 | 0 |
| 0.7770833333333332 | 0 |
| 0.7777777777777778 | 0 |
| 0.7784722222222222 | 0 |
| 0.7791666666666667 | 0 |
| 0.779861111111111 | 0 |
| 0.7805555555555556 | 0 |
| 0.78125 | 0 |
| 0.7819444444444444 | 0 |
| 0.782638888888889 | 0 |
| 0.7833333333333333 | 0 |
| 0.7840277777777778 | 0 |
| 0.7847222222222222 | 0 |
| 0.7854166666666668 | 0 |
| 0.7861111111111111 | 0 |
| 0.7868055555555555 | 0 |
| 0.7875 | 0 |
| 0.7881944444444445 | 0 |
| 0.7888888888888889 | 0 |
| 0.7895833333333333 | 0 |
| 0.7902777777777777 | 0 |
| 0.7909722222222223 | 0 |
| 0.7916666666666666 | 0 |
| 0.7923611111111111 | 0 |
| 0.7930555555555556 | 0 |
| 0.7937500000000001 | 0 |
| 0.7944444444444444 | 0 |
| 0.7951388888888888 | 0 |
| 0.7958333333333334 | 0 |
| 0.7965277777777778 | 0 |
| 0.7972222222222222 | 0 |
| 0.7979166666666666 | 0 |
| 0.7986111111111112 | 0 |
| 0.7993055555555556 | 0 |
| 0.7999999999999999 | 0 |
| 0.8006944444444444 | 0 |
| 0.8013888888888889 | 0 |
| 0.8020833333333334 | 0 |
| 0.8027777777777777 | 0 |
| 0.8034722222222223 | 0 |
| 0.8041666666666667 | 0 |
| 0.8048611111111111 | 0 |
| 0.8055555555555555 | 0 |
| 0.80625 | 0 |
| 0.8069444444444445 | 0 |
| 0.8076388888888889 | 0 |
| 0.8083333333333332 | 0 |
| 0.8090277777777778 | 0 |
| 0.8097222222222222 | 0 |
| 0.8104166666666667 | 0 |
| 0.811111111111111 | 0 |
| 0.8118055555555556 | 0 |
| 0.8125 | 0 |
| 0.8131944444444444 | 0 |
| 0.813888888888889 | 0 |
| 0.8145833333333333 | 0 |
| 0.8152777777777778 | 0 |
| 0.8159722222222222 | 0 |
| 0.8166666666666668 | 0 |
| 0.8173611111111111 | 0 |
| 0.8180555555555555 | 0 |
| 0.81875 | 0 |
| 0.8194444444444445 | 0 |
| 0.8201388888888889 | 0 |
| 0.8208333333333333 | 0 |
| 0.8215277777777777 | 0 |
| 0.8222222222222223 | 0 |
| 0.8229166666666666 | 0 |
| 0.8236111111111111 | 0 |
| 0.8243055555555556 | 0 |
| 0.8250000000000001 | 0 |
| 0.8256944444444444 | 0 |
| 0.8263888888888888 | 0 |
| 0.8270833333333334 | 0 |
| 0.8277777777777778 | 0 |
| 0.8284722222222222 | 0 |
| 0.8291666666666666 | 0 |
| 0.8298611111111112 | 0 |
| 0.8305555555555556 | 0 |
| 0.8312499999999999 | 0 |
| 0.8319444444444444 | 0 |
| 0.8326388888888889 | 0 |
| 0.8333333333333334 | 0 |
| 0.8340277777777777 | 0 |
| 0.8347222222222223 | 0 |
| 0.8354166666666667 | 0 |
| 0.8361111111111111 | 0 |
| 0.8368055555555555 | 0 |
| 0.8375 | 0 |
| 0.8381944444444445 | 0 |
| 0.8388888888888889 | 0 |
| 0.8395833333333332 | 0 |
| 0.8402777777777778 | 0 |
| 0.8409722222222222 | 0 |
| 0.8416666666666667 | 0 |
| 0.842361111111111 | 0 |
| 0.8430555555555556 | 0 |
| 0.84375 | 0 |
| 0.8444444444444444 | 0 |
| 0.845138888888889 | 0 |
| 0.8458333333333333 | 0 |
| 0.8465277777777778 | 0 |
| 0.8472222222222222 | 0 |
| 0.8479166666666668 | 0 |
| 0.8486111111111111 | 0 |
| 0.8493055555555555 | 0 |
| 0.85 | 0 |
| 0.8506944444444445 | 0 |
| 0.8513888888888889 | 0 |
| 0.8520833333333333 | 0 |
| 0.8527777777777777 | 0 |
| 0.8534722222222223 | 0 |
| 0.8541666666666666 | 0 |
| 0.8548611111111111 | 0 |
| 0.8555555555555556 | 0 |
| 0.8562500000000001 | 0 |
| 0.8569444444444444 | 0 |
| 0.8576388888888888 | 0 |
| 0.8583333333333334 | 0 |
| 0.8590277777777778 | 0 |
| 0.8597222222222222 | 0 |
| 0.8604166666666666 | 0 |
| 0.8611111111111112 | 0 |
| 0.8618055555555556 | 0 |
| 0.8624999999999999 | 0 |
| 0.8631944444444444 | 0 |
| 0.8638888888888889 | 0 |
| 0.8645833333333334 | 0 |
| 0.8652777777777777 | 0 |
| 0.8659722222222223 | 0 |
| 0.8666666666666667 | 0 |
| 0.8673611111111111 | 0 |
| 0.8680555555555555 | 0 |
| 0.86875 | 0 |
| 0.8694444444444445 | 0 |
| 0.8701388888888889 | 0 |
| 0.8708333333333332 | 0 |
| 0.8715277777777778 | 0 |
| 0.8722222222222222 | 0 |
| 0.8729166666666667 | 0 |
| 0.873611111111111 | 0 |
| 0.8743055555555556 | 0 |
| 0.875 | 0 |
| 0.8756944444444444 | 0 |
| 0.876388888888889 | 0 |
| 0.8770833333333333 | 0 |
| 0.8777777777777778 | 0 |
| 0.8784722222222222 | 0 |
| 0.8791666666666668 | 0 |
| 0.8798611111111111 | 0 |
| 0.8805555555555555 | 0 |
| 0.88125 | 0 |
| 0.8819444444444445 | 0 |
| 0.8826388888888889 | 0 |
| 0.8833333333333333 | 0 |
| 0.8840277777777777 | 0 |
| 0.8847222222222223 | 0 |
| 0.8854166666666666 | 0 |
| 0.8861111111111111 | 0 |
| 0.8868055555555556 | 0 |
| 0.8875000000000001 | 0 |
| 0.8881944444444444 | 0 |
| 0.8888888888888888 | 0 |
| 0.8895833333333334 | 0 |
| 0.8902777777777778 | 0 |
| 0.8909722222222222 | 0 |
| 0.8916666666666666 | 0 |
| 0.8923611111111112 | 0 |
| 0.8930555555555556 | 0 |
| 0.8937499999999999 | 0 |
| 0.8944444444444444 | 0 |
| 0.8951388888888889 | 0 |
| 0.8958333333333334 | 0 |
| 0.8965277777777777 | 0 |
| 0.8972222222222223 | 0 |
| 0.8979166666666667 | 0 |
| 0.8986111111111111 | 0 |
| 0.8993055555555555 | 0 |
| 0.9 | 0 |
| 0.9006944444444445 | 0 |
| 0.9013888888888889 | 0 |
| 0.9020833333333332 | 0 |
| 0.9027777777777778 | 0 |
| 0.9034722222222222 | 0 |
| 0.9041666666666667 | 0 |
| 0.904861111111111 | 0 |
| 0.9055555555555556 | 0 |
| 0.90625 | 0 |
| 0.9069444444444444 | 0 |
| 0.907638888888889 | 0 |
| 0.9083333333333333 | 0 |
| 0.9090277777777778 | 0 |
| 0.9097222222222222 | 0 |
| 0.9104166666666668 | 0 |
| 0.9111111111111111 | 0 |
| 0.9118055555555555 | 0 |
| 0.9125 | 0 |
| 0.9131944444444445 | 0 |
| 0.9138888888888889 | 0 |
| 0.9145833333333333 | 0 |
| 0.9152777777777777 | 0 |
| 0.9159722222222223 | 0 |
| 0.9166666666666666 | 0 |
| 0.9173611111111111 | 0 |
| 0.9180555555555556 | 0 |
| 0.9187500000000001 | 0 |
| 0.9194444444444444 | 0 |
| 0.9201388888888888 | 0 |
| 0.9208333333333334 | 0 |
| 0.9215277777777778 | 0 |
| 0.9222222222222222 | 0 |
| 0.9229166666666666 | 0 |
| 0.9236111111111112 | 0 |
| 0.9243055555555556 | 0 |
| 0.9249999999999999 | 0 |
| 0.9256944444444444 | 0 |
| 0.9263888888888889 | 0 |
| 0.9270833333333334 | 0 |
| 0.9277777777777777 | 0 |
| 0.9284722222222223 | 0 |
| 0.9291666666666667 | 0 |
| 0.9298611111111111 | 0 |
| 0.9305555555555555 | 0 |
| 0.93125 | 0 |
| 0.9319444444444445 | 0 |
| 0.9326388888888889 | 0 |
| 0.9333333333333332 | 0 |
| 0.9340277777777778 | 0 |
| 0.9347222222222222 | 0 |
| 0.9354166666666667 | 0 |
| 0.936111111111111 | 0 |
| 0.9368055555555556 | 0 |
| 0.9375 | 0 |
| 0.9381944444444444 | 0 |
| 0.938888888888889 | 0 |
| 0.9395833333333333 | 0 |
| 0.9402777777777778 | 0 |
| 0.9409722222222222 | 0 |
| 0.9416666666666668 | 0 |
| 0.9423611111111111 | 0 |
| 0.9430555555555555 | 0 |
| 0.94375 | 0 |
| 0.9444444444444445 | 0 |
| 0.9451388888888889 | 0 |
| 0.9458333333333333 | 0 |
| 0.9465277777777777 | 0 |
| 0.9472222222222223 | 0 |
| 0.9479166666666666 | 0 |
| 0.9486111111111111 | 0 |
| 0.9493055555555556 | 0 |
| 0.9500000000000001 | 0 |
| 0.9506944444444444 | 0 |
| 0.9513888888888888 | 0 |
| 0.9520833333333334 | 0 |
| 0.9527777777777778 | 0 |
| 0.9534722222222222 | 0 |
| 0.9541666666666666 | 0 |
| 0.9548611111111112 | 0 |
| 0.9555555555555556 | 0 |
| 0.9562499999999999 | 0 |
| 0.9569444444444444 | 0 |
| 0.9576388888888889 | 0 |
| 0.9583333333333334 | 0 |
| 0.9590277777777777 | 0 |
| 0.9597222222222223 | 0 |
| 0.9604166666666667 | 0 |
| 0.9611111111111111 | 0 |
| 0.9618055555555555 | 0 |
| 0.9625 | 0 |
| 0.9631944444444445 | 0 |
| 0.9638888888888889 | 0 |
| 0.9645833333333332 | 0 |
| 0.9652777777777778 | 0 |
| 0.9659722222222222 | 0 |
| 0.9666666666666667 | 0 |
| 0.967361111111111 | 0 |
| 0.9680555555555556 | 0 |
| 0.96875 | 0 |
| 0.9694444444444444 | 0 |
| 0.970138888888889 | 0 |
| 0.9708333333333333 | 0 |
| 0.9715277777777778 | 0 |
| 0.9722222222222222 | 0 |
| 0.9729166666666668 | 0 |
| 0.9736111111111111 | 0 |
| 0.9743055555555555 | 0 |
| 0.975 | 0 |
| 0.9756944444444445 | 0 |
| 0.9763888888888889 | 0 |
| 0.9770833333333333 | 0 |
| 0.9777777777777777 | 0 |
| 0.9784722222222223 | 0 |
| 0.9791666666666666 | 0 |
| 0.9798611111111111 | 0 |
| 0.9805555555555556 | 0 |
| 0.9812500000000001 | 0 |
| 0.9819444444444444 | 0 |
| 0.9826388888888888 | 0 |
| 0.9833333333333334 | 0 |
| 0.9840277777777778 | 0 |
| 0.9847222222222222 | 0 |
| 0.9854166666666666 | 0 |
| 0.9861111111111112 | 0 |
| 0.9868055555555556 | 0 |
| 0.9874999999999999 | 0 |
| 0.9881944444444444 | 0 |
| 0.9888888888888889 | 0 |
| 0.9895833333333334 | 0 |
| 0.9902777777777777 | 0 |
| 0.9909722222222223 | 0 |
| 0.9916666666666667 | 0 |
| 0.9923611111111111 | 0 |
| 0.9930555555555555 | 0 |
| 0.99375 | 0 |
| 0.9944444444444445 | 0 |
| 0.9951388888888889 | 0 |
| 0.9958333333333332 | 0 |
| 0.9965277777777778 | 0 |
| 0.9972222222222222 | 0 |
| 0.9979166666666667 | 0 |
| 0.998611111111111 | 0 |
| 0.9993055555555556 | 0 |